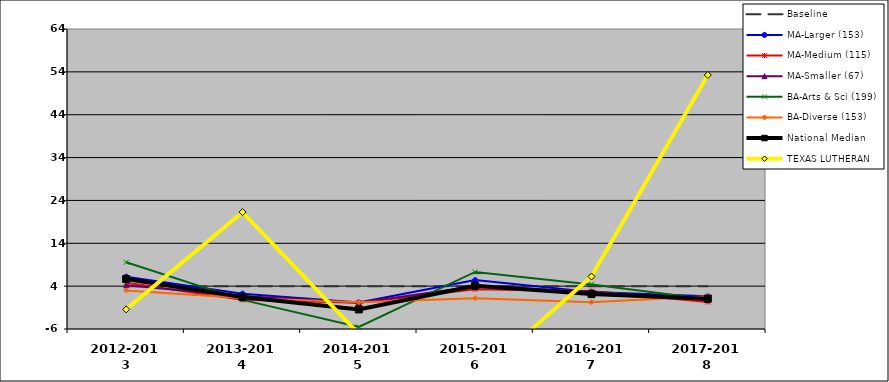
| Category | Baseline | MA-Larger (153) | MA-Medium (115) | MA-Smaller (67) | BA-Arts & Sci (199) | BA-Diverse (153) | National Median | TEXAS LUTHERAN |
|---|---|---|---|---|---|---|---|---|
| 2012-2013 | 4 | 6.209 | 4.813 | 4.194 | 9.571 | 2.997 | 5.667 | -1.419 |
| 2013-2014 | 4 | 2.245 | 0.803 | 1.724 | 0.801 | 1.234 | 1.445 | 21.272 |
| 2014-2015 | 4 | 0.201 | 0.115 | 0.104 | -5.511 | 0.228 | -1.431 | -7.157 |
| 2015-2016 | 4 | 5.404 | 3.256 | 3.999 | 7.311 | 1.198 | 4.105 | -17.719 |
| 2016-2017 | 4 | 2.641 | 2.831 | 2.768 | 4.395 | 0.261 | 2.148 | 6.249 |
| 2017-2018 | 4 | 1.614 | 0.307 | 0.759 | 0.915 | 1.618 | 1.087 | 53.269 |